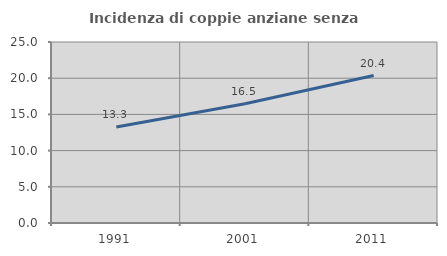
| Category | Incidenza di coppie anziane senza figli  |
|---|---|
| 1991.0 | 13.26 |
| 2001.0 | 16.477 |
| 2011.0 | 20.37 |